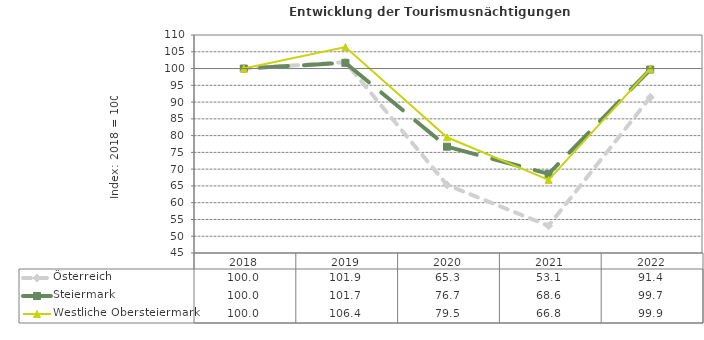
| Category | Österreich | Steiermark | Westliche Obersteiermark |
|---|---|---|---|
| 2022.0 | 91.4 | 99.7 | 99.9 |
| 2021.0 | 53.1 | 68.6 | 66.8 |
| 2020.0 | 65.3 | 76.7 | 79.5 |
| 2019.0 | 101.9 | 101.7 | 106.4 |
| 2018.0 | 100 | 100 | 100 |